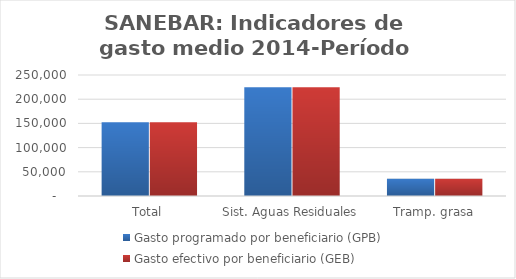
| Category | Gasto programado por beneficiario (GPB)  | Gasto efectivo por beneficiario (GEB)  |
|---|---|---|
| Total | 152380.203 | 152260.347 |
| Sist. Aguas Residuales | 224812.8 | 224812.8 |
| Tramp. grasa | 35822 | 35822 |